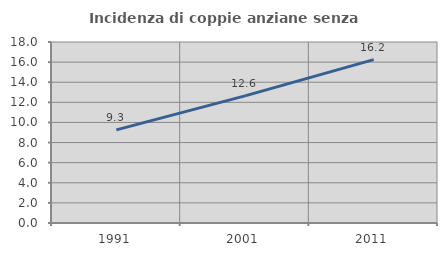
| Category | Incidenza di coppie anziane senza figli  |
|---|---|
| 1991.0 | 9.26 |
| 2001.0 | 12.639 |
| 2011.0 | 16.247 |